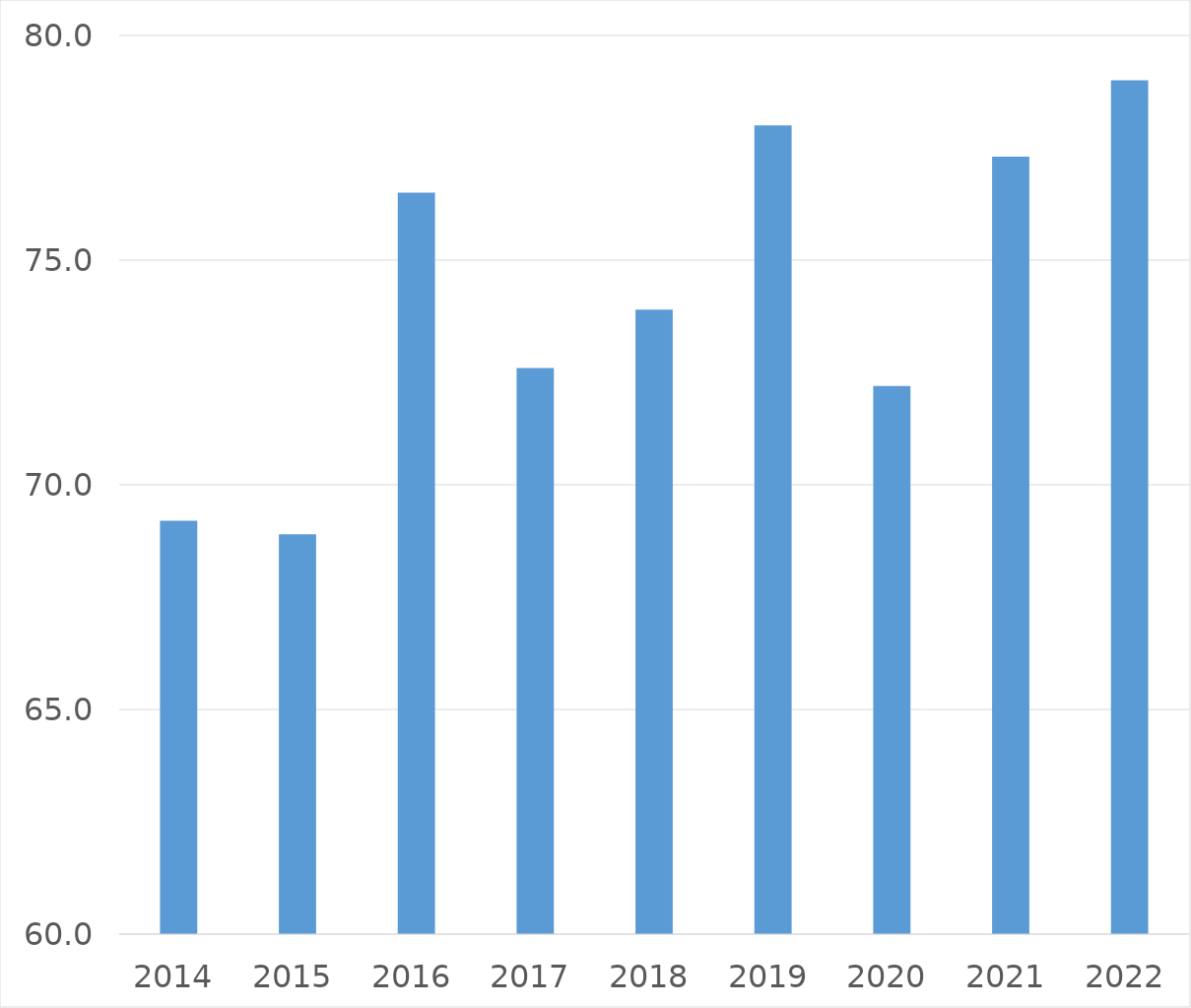
| Category | Series 0 |
|---|---|
| 2014 | 69.2 |
| 2015 | 68.9 |
| 2016 | 76.5 |
| 2017 | 72.6 |
| 2018 | 73.9 |
| 2019 | 78 |
| 2020 | 72.2 |
| 2021 | 77.3 |
| 2022 | 79 |